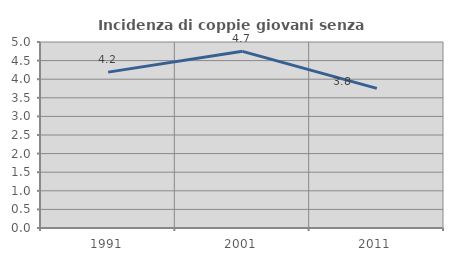
| Category | Incidenza di coppie giovani senza figli |
|---|---|
| 1991.0 | 4.19 |
| 2001.0 | 4.749 |
| 2011.0 | 3.753 |